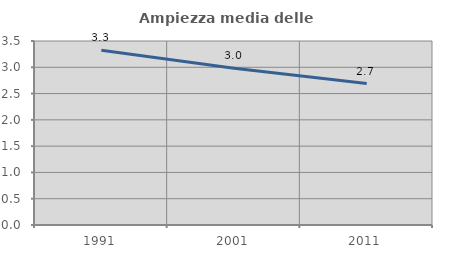
| Category | Ampiezza media delle famiglie |
|---|---|
| 1991.0 | 3.323 |
| 2001.0 | 2.981 |
| 2011.0 | 2.69 |